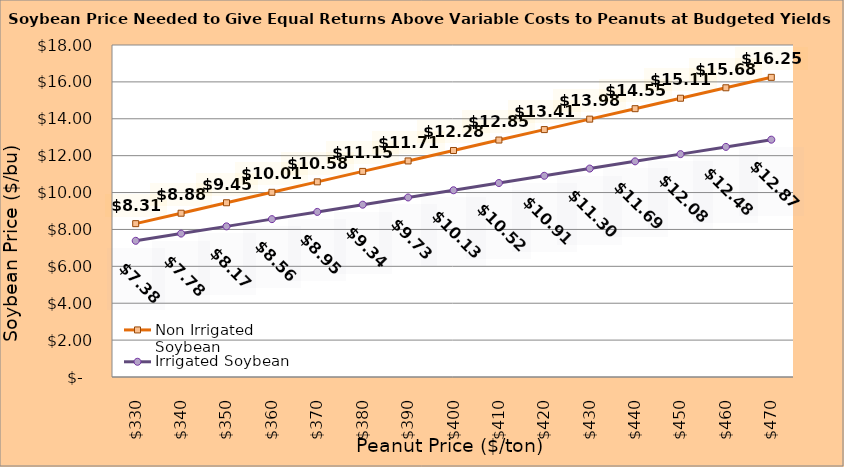
| Category | Non Irrigated Soybean | Irrigated Soybean |
|---|---|---|
| 330.0 | 8.314 | 7.384 |
| 340.0 | 8.881 | 7.775 |
| 350.0 | 9.447 | 8.167 |
| 360.0 | 10.014 | 8.559 |
| 370.0 | 10.581 | 8.95 |
| 380.0 | 11.147 | 9.342 |
| 390.0 | 11.714 | 9.734 |
| 400.0 | 12.281 | 10.125 |
| 410.0 | 12.847 | 10.517 |
| 420.0 | 13.414 | 10.909 |
| 430.0 | 13.981 | 11.3 |
| 440.0 | 14.547 | 11.692 |
| 450.0 | 15.114 | 12.084 |
| 460.0 | 15.681 | 12.475 |
| 470.0 | 16.247 | 12.867 |